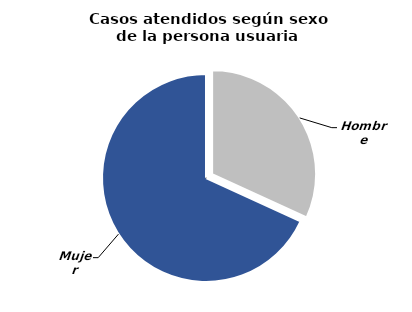
| Category | Series 0 |
|---|---|
| Hombre | 1384 |
| Mujer | 2962 |